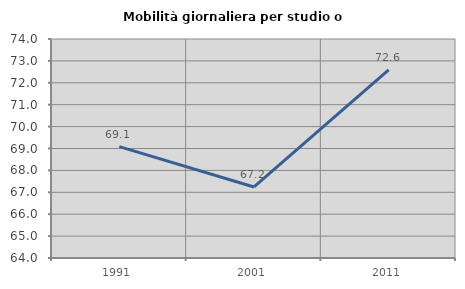
| Category | Mobilità giornaliera per studio o lavoro |
|---|---|
| 1991.0 | 69.088 |
| 2001.0 | 67.244 |
| 2011.0 | 72.595 |